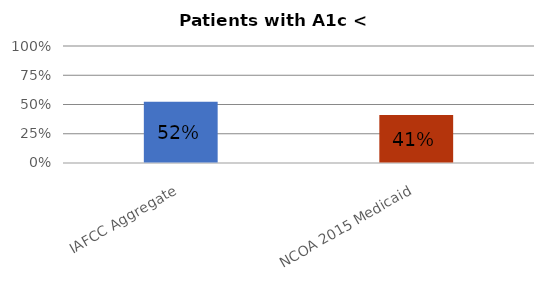
| Category | Series 0 |
|---|---|
| IAFCC Aggregate | 0.524 |
| NCOA 2015 Medicaid | 0.41 |